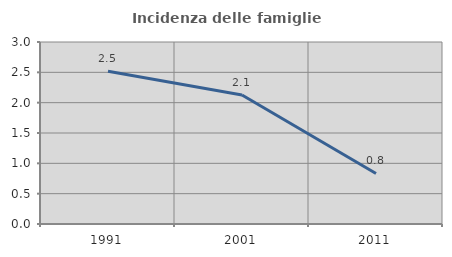
| Category | Incidenza delle famiglie numerose |
|---|---|
| 1991.0 | 2.517 |
| 2001.0 | 2.128 |
| 2011.0 | 0.833 |